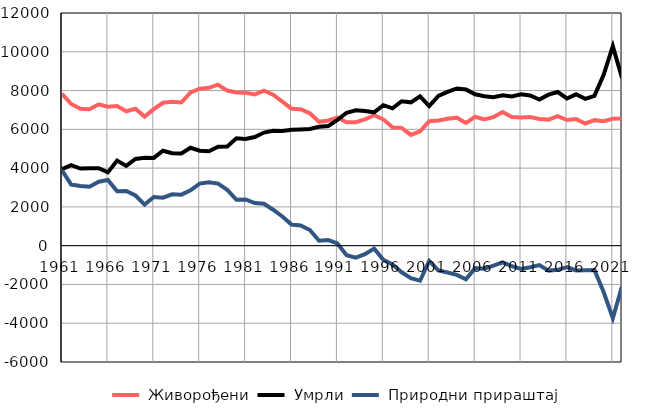
| Category |  Живорођени |  Умрли |  Природни прираштај |
|---|---|---|---|
| 1961.0 | 7835 | 3949 | 3886 |
| 1962.0 | 7306 | 4156 | 3150 |
| 1963.0 | 7060 | 3977 | 3083 |
| 1964.0 | 7034 | 3997 | 3037 |
| 1965.0 | 7289 | 3991 | 3298 |
| 1966.0 | 7170 | 3780 | 3390 |
| 1967.0 | 7198 | 4386 | 2812 |
| 1968.0 | 6932 | 4114 | 2818 |
| 1969.0 | 7061 | 4474 | 2587 |
| 1970.0 | 6657 | 4537 | 2120 |
| 1971.0 | 7039 | 4526 | 2513 |
| 1972.0 | 7370 | 4896 | 2474 |
| 1973.0 | 7418 | 4767 | 2651 |
| 1974.0 | 7385 | 4753 | 2632 |
| 1975.0 | 7900 | 5048 | 2852 |
| 1976.0 | 8099 | 4900 | 3199 |
| 1977.0 | 8140 | 4872 | 3268 |
| 1978.0 | 8302 | 5099 | 3203 |
| 1979.0 | 7999 | 5119 | 2880 |
| 1980.0 | 7901 | 5535 | 2366 |
| 1981.0 | 7891 | 5506 | 2385 |
| 1982.0 | 7802 | 5601 | 2201 |
| 1983.0 | 7998 | 5834 | 2164 |
| 1984.0 | 7783 | 5930 | 1853 |
| 1985.0 | 7426 | 5919 | 1507 |
| 1986.0 | 7064 | 5978 | 1086 |
| 1987.0 | 7038 | 5995 | 1043 |
| 1988.0 | 6827 | 6022 | 805 |
| 1989.0 | 6390 | 6133 | 257 |
| 1990.0 | 6458 | 6166 | 292 |
| 1991.0 | 6607 | 6493 | 114 |
| 1992.0 | 6362 | 6855 | -493 |
| 1993.0 | 6367 | 6985 | -618 |
| 1994.0 | 6508 | 6949 | -441 |
| 1995.0 | 6732 | 6879 | -147 |
| 1996.0 | 6515 | 7244 | -729 |
| 1997.0 | 6108 | 7081 | -973 |
| 1998.0 | 6076 | 7448 | -1372 |
| 1999.0 | 5713 | 7393 | -1680 |
| 2000.0 | 5897 | 7705 | -1808 |
| 2001.0 | 6415 | 7202 | -787 |
| 2002.0 | 6453 | 7726 | -1273 |
| 2003.0 | 6550 | 7931 | -1381 |
| 2004.0 | 6602 | 8107 | -1505 |
| 2005.0 | 6330 | 8059 | -1729 |
| 2006.0 | 6649 | 7808 | -1159 |
| 2007.0 | 6512 | 7704 | -1192 |
| 2008.0 | 6630 | 7661 | -1031 |
| 2009.0 | 6895 | 7762 | -867 |
| 2010.0 | 6640 | 7692 | -1052 |
| 2011.0 | 6605 | 7804 | -1199 |
| 2012.0 | 6630 | 7744 | -1114 |
| 2013.0 | 6537 | 7538 | -1001 |
| 2014.0 | 6502 | 7788 | -1286 |
| 2015.0 | 6679 | 7924 | -1245 |
| 2016.0 | 6482 | 7590 | -1108 |
| 2017.0 | 6529 | 7806 | -1277 |
| 2018.0 | 6302 | 7570 | -1268 |
| 2019.0 | 6474 | 7730 | -1256 |
| 2020.0 | 6418 | 8809 | -2391 |
| 2021.0 | 6549 | 10290 | -3741 |
| 2022.0 | 6554 | 8652 | -2098 |